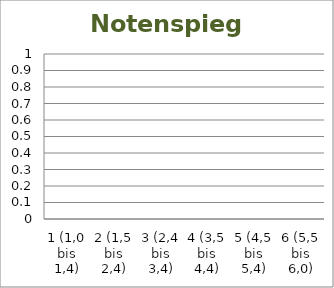
| Category | Series 0 |
|---|---|
| 1 (1,0 bis 1,4) | 0 |
| 2 (1,5 bis 2,4) | 0 |
| 3 (2,4 bis 3,4) | 0 |
| 4 (3,5 bis 4,4) | 0 |
| 5 (4,5 bis 5,4) | 0 |
| 6 (5,5 bis 6,0) | 0 |